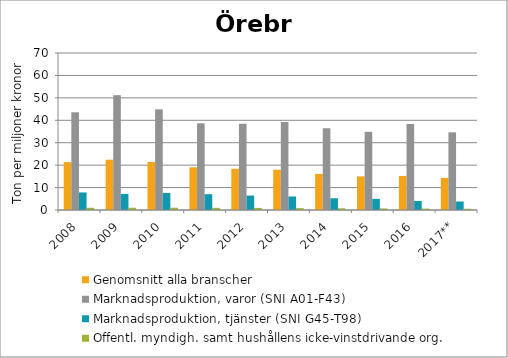
| Category | Genomsnitt alla branscher | Marknadsproduktion, varor (SNI A01-F43) | Marknadsproduktion, tjänster (SNI G45-T98) | Offentl. myndigh. samt hushållens icke-vinstdrivande org. |
|---|---|---|---|---|
| 2008 | 21.354 | 43.561 | 7.819 | 1.006 |
| 2009 | 22.447 | 51.196 | 7.174 | 1.013 |
| 2010 | 21.419 | 44.869 | 7.618 | 1.031 |
| 2011 | 19.035 | 38.639 | 7.045 | 0.96 |
| 2012 | 18.398 | 38.49 | 6.426 | 0.929 |
| 2013 | 17.962 | 39.206 | 6.034 | 0.843 |
| 2014 | 16.092 | 36.448 | 5.226 | 0.76 |
| 2015 | 14.985 | 34.871 | 4.959 | 0.703 |
| 2016 | 15.188 | 38.302 | 4.005 | 0.634 |
| 2017** | 14.307 | 34.619 | 3.781 | 0.57 |